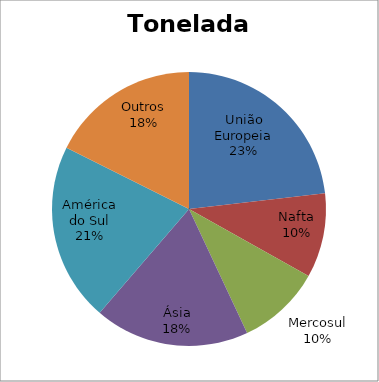
| Category | Series 0 |
|---|---|
| União Europeia | 0.232 |
| Nafta | 0.1 |
| Mercosul | 0.099 |
| Ásia | 0.183 |
| América do Sul | 0.211 |
| Outros | 0.176 |